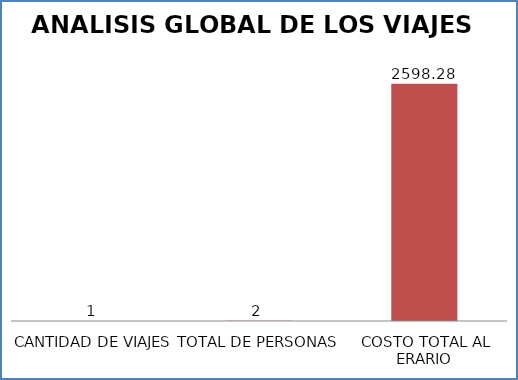
| Category | Series 0 |
|---|---|
| CANTIDAD DE VIAJES | 1 |
| TOTAL DE PERSONAS | 2 |
| COSTO TOTAL AL ERARIO | 2598.28 |